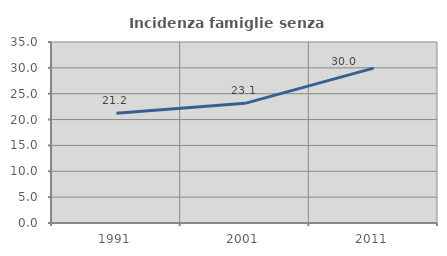
| Category | Incidenza famiglie senza nuclei |
|---|---|
| 1991.0 | 21.205 |
| 2001.0 | 23.137 |
| 2011.0 | 29.951 |